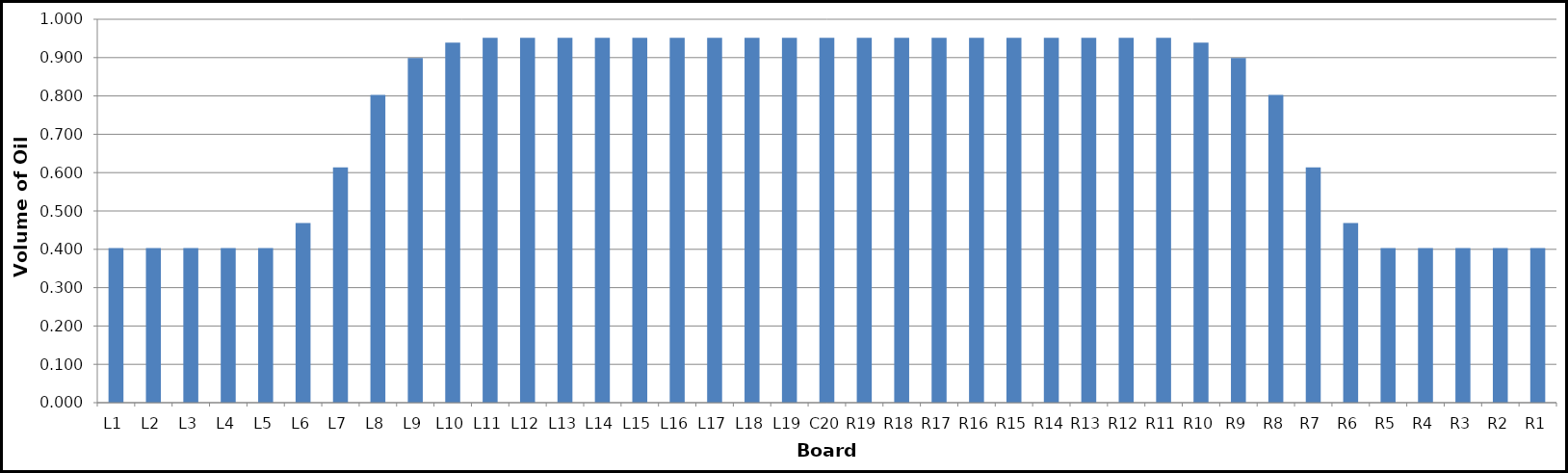
| Category | Series 0 |
|---|---|
| L1 | 0.403 |
| L2 | 0.403 |
| L3 | 0.403 |
| L4 | 0.403 |
| L5 | 0.403 |
| L6 | 0.469 |
| L7 | 0.614 |
| L8 | 0.803 |
| L9 | 0.899 |
| L10 | 0.939 |
| L11 | 0.952 |
| L12 | 0.952 |
| L13 | 0.952 |
| L14 | 0.952 |
| L15 | 0.952 |
| L16 | 0.952 |
| L17 | 0.952 |
| L18 | 0.952 |
| L19 | 0.952 |
| C20 | 0.952 |
| R19 | 0.952 |
| R18 | 0.952 |
| R17 | 0.952 |
| R16 | 0.952 |
| R15 | 0.952 |
| R14 | 0.952 |
| R13 | 0.952 |
| R12 | 0.952 |
| R11 | 0.952 |
| R10 | 0.939 |
| R9 | 0.899 |
| R8 | 0.803 |
| R7 | 0.614 |
| R6 | 0.469 |
| R5 | 0.403 |
| R4 | 0.403 |
| R3 | 0.403 |
| R2 | 0.403 |
| R1 | 0.403 |